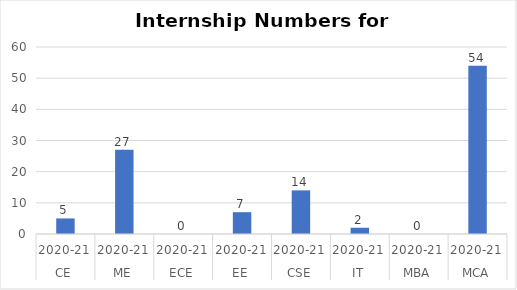
| Category | Internship Numbers |
|---|---|
| 0 | 5 |
| 1 | 27 |
| 2 | 0 |
| 3 | 7 |
| 4 | 14 |
| 5 | 2 |
| 6 | 0 |
| 7 | 54 |